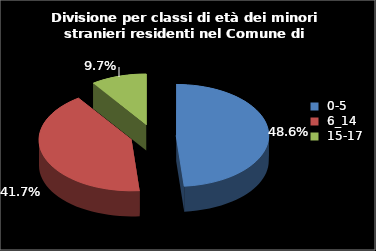
| Category | Series 0 |
|---|---|
| 0-5 | 35 |
| 6_14 | 30 |
| 15-17 | 7 |